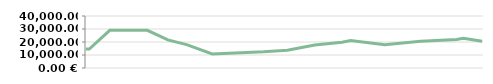
| Category | MOIS   |
|---|---|
| 2013-04-23 | 14600 |
| 2013-04-25 | 14600 |
| 2013-05-07 | 29000 |
| 2013-05-14 | 29000 |
| 2013-05-14 | 29000 |
| 2013-05-29 | 29000 |
| 2013-06-10 | 21600 |
| 2013-06-21 | 17950 |
| 2013-07-06 | 10776.471 |
| 2013-08-05 | 12455.862 |
| 2013-08-19 | 13667.568 |
| 2013-09-04 | 17651.667 |
| 2013-09-20 | 19877.912 |
| 2013-09-25 | 21138.05 |
| 2013-10-15 | 17951.744 |
| 2013-11-05 | 20556.13 |
| 2013-11-26 | 21997.139 |
| 2013-11-30 | 22917.635 |
| 2013-12-11 | 20504.315 |